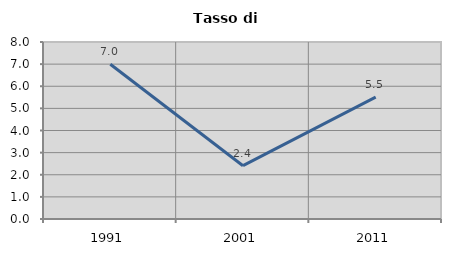
| Category | Tasso di disoccupazione   |
|---|---|
| 1991.0 | 6.993 |
| 2001.0 | 2.41 |
| 2011.0 | 5.51 |